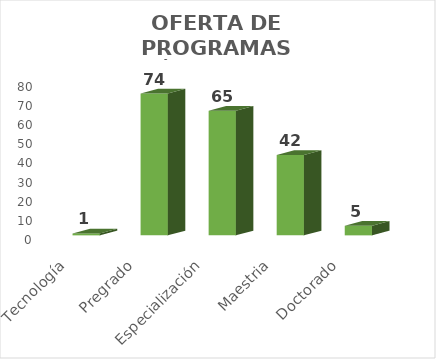
| Category | Tecnología  |
|---|---|
| Tecnología  | 1 |
| Pregrado  | 74 |
| Especialización  | 65 |
| Maestria  | 42 |
| Doctorado  | 5 |